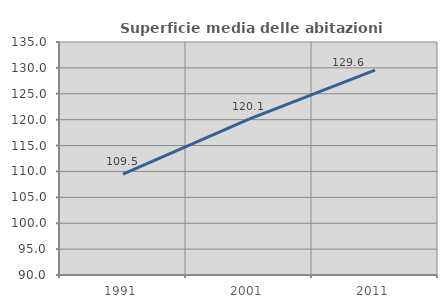
| Category | Superficie media delle abitazioni occupate |
|---|---|
| 1991.0 | 109.498 |
| 2001.0 | 120.108 |
| 2011.0 | 129.552 |